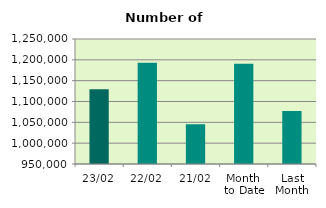
| Category | Series 0 |
|---|---|
| 23/02 | 1129286 |
| 22/02 | 1193010 |
| 21/02 | 1045444 |
| Month 
to Date | 1190493.529 |
| Last
Month | 1077187.636 |